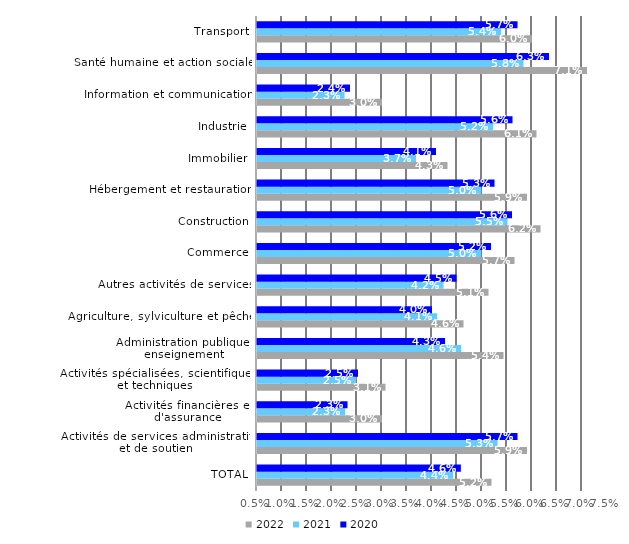
| Category | 2022 | 2021 | 2020 |
|---|---|---|---|
| TOTAL | 0.052 | 0.044 | 0.046 |
| Activités de services administratifs et de soutien | 0.059 | 0.053 | 0.057 |
| Activités financières et d'assurance | 0.03 | 0.023 | 0.023 |
| Activités spécialisées, scientifiques et techniques | 0.031 | 0.025 | 0.025 |
| Administration publique, enseignement | 0.054 | 0.046 | 0.043 |
| Agriculture, sylviculture et pêche | 0.046 | 0.041 | 0.04 |
| Autres activités de services | 0.051 | 0.042 | 0.045 |
| Commerce | 0.056 | 0.05 | 0.052 |
| Construction | 0.062 | 0.055 | 0.056 |
| Hébergement et restauration | 0.059 | 0.05 | 0.052 |
| Immobilier | 0.043 | 0.037 | 0.041 |
| Industrie | 0.061 | 0.052 | 0.056 |
| Information et communication | 0.03 | 0.022 | 0.024 |
| Santé humaine et action sociale | 0.071 | 0.058 | 0.063 |
| Transport | 0.06 | 0.054 | 0.057 |